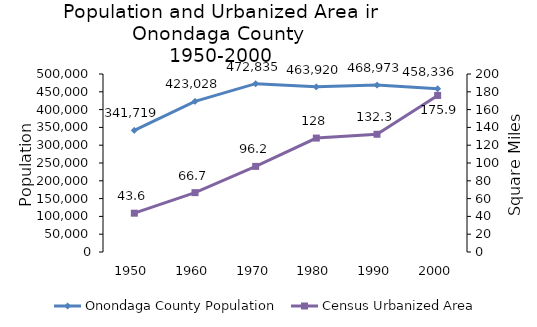
| Category | Onondaga County Population |
|---|---|
| 1950.0 | 341719 |
| 1960.0 | 423028 |
| 1970.0 | 472835 |
| 1980.0 | 463920 |
| 1990.0 | 468973 |
| 2000.0 | 458336 |